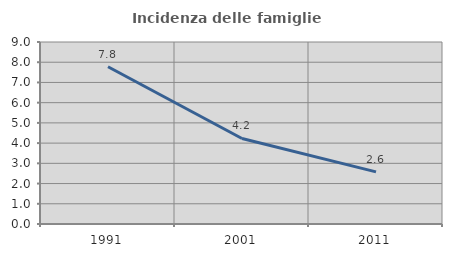
| Category | Incidenza delle famiglie numerose |
|---|---|
| 1991.0 | 7.778 |
| 2001.0 | 4.23 |
| 2011.0 | 2.579 |